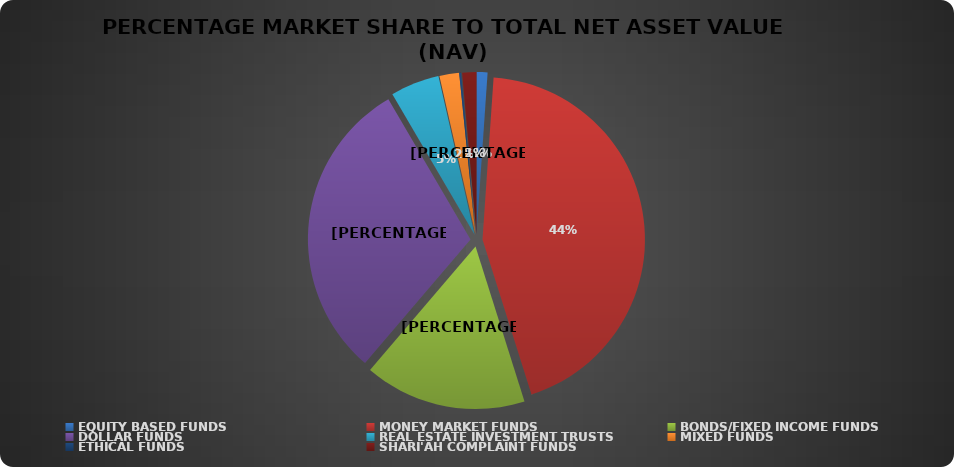
| Category | NET ASSET VALUE |
|---|---|
| EQUITY BASED FUNDS | 20938164830.36 |
| MONEY MARKET FUNDS | 846543599278.248 |
| BONDS/FIXED INCOME FUNDS | 309847018533.154 |
| DOLLAR FUNDS | 583012756562.625 |
| REAL ESTATE INVESTMENT TRUSTS | 93572406322.79 |
| MIXED FUNDS | 37664855902.908 |
| ETHICAL FUNDS | 3699554011.37 |
| SHARI'AH COMPLAINT FUNDS | 27169515243.78 |